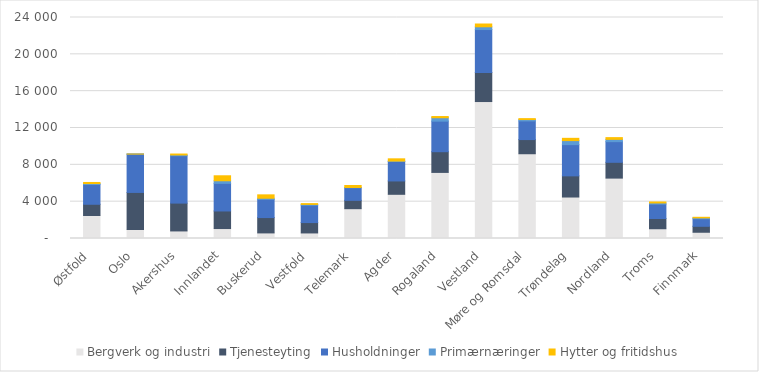
| Category | Bergverk og industri | Tjenesteyting | Husholdninger | Primærnæringer | Hytter og fritidshus |
|---|---|---|---|---|---|
| Østfold | 2497.5 | 1220.3 | 2142.2 | 107.4 | 117.8 |
| Oslo | 976.7 | 4026.5 | 4163.8 | 2.1 | 1.3 |
| Akershus | 821.5 | 3022.4 | 5146.3 | 81.4 | 102.2 |
| Innlandet | 1080.5 | 1908.2 | 2997.1 | 283.4 | 542.1 |
| Buskerud | 607 | 1667.5 | 1979.1 | 118.3 | 368.5 |
| Vestfold | 603.3 | 1127.1 | 1884.9 | 86.5 | 86.8 |
| Telemark | 3238 | 905.5 | 1373.8 | 24.5 | 216.6 |
| Agder | 4799.3 | 1450.2 | 2113.1 | 48.3 | 241.6 |
| Rogaland | 7176.5 | 2248.4 | 3317.9 | 370.2 | 132.4 |
| Vestland | 14873 | 3154.7 | 4664.6 | 299.1 | 302.6 |
| Møre og Romsdal | 9204.6 | 1538.1 | 2025.6 | 150.7 | 98.5 |
| Trøndelag | 4504.1 | 2298.1 | 3392.2 | 437 | 247.4 |
| Nordland | 6558.3 | 1716 | 2243.7 | 246.8 | 190.4 |
| Troms | 1060.4 | 1111.4 | 1565.2 | 122.6 | 108.5 |
| Finnmark | 677.6 | 648.2 | 822.6 | 92.6 | 62.5 |